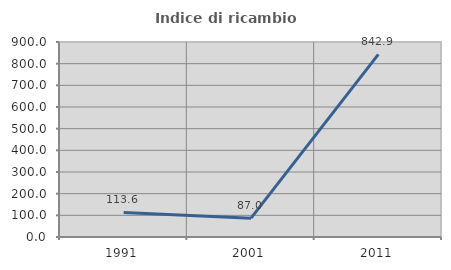
| Category | Indice di ricambio occupazionale  |
|---|---|
| 1991.0 | 113.636 |
| 2001.0 | 86.957 |
| 2011.0 | 842.857 |